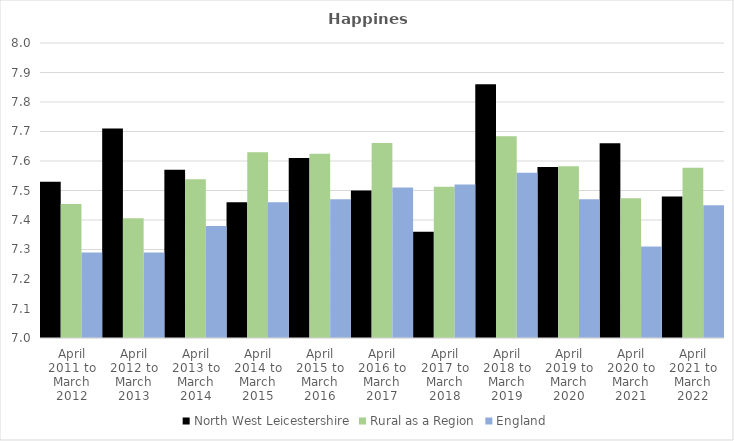
| Category | North West Leicestershire | Rural as a Region | England |
|---|---|---|---|
| April 2011 to March 2012 | 7.53 | 7.454 | 7.29 |
| April 2012 to March 2013 | 7.71 | 7.406 | 7.29 |
| April 2013 to March 2014 | 7.57 | 7.539 | 7.38 |
| April 2014 to March 2015 | 7.46 | 7.63 | 7.46 |
| April 2015 to March 2016 | 7.61 | 7.625 | 7.47 |
| April 2016 to March 2017 | 7.5 | 7.661 | 7.51 |
| April 2017 to March 2018 | 7.36 | 7.513 | 7.52 |
| April 2018 to March 2019 | 7.86 | 7.684 | 7.56 |
| April 2019 to March 2020 | 7.58 | 7.582 | 7.47 |
| April 2020 to March 2021 | 7.66 | 7.474 | 7.31 |
| April 2021 to March 2022 | 7.48 | 7.577 | 7.45 |